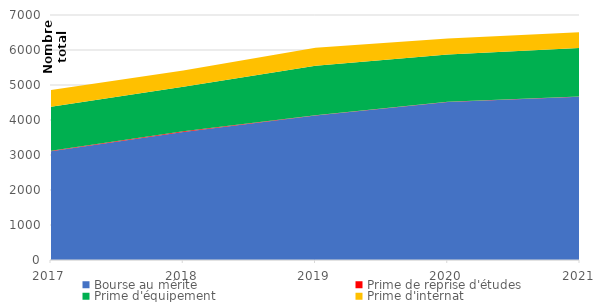
| Category | Bourse au mérite | Prime de reprise d'études | Prime d'équipement | Prime d'internat |
|---|---|---|---|---|
| 2017.0 | 3109 | 14 | 1253 | 481 |
| 2018.0 | 3659 | 18 | 1275 | 465 |
| 2019.0 | 4132 | 5 | 1412 | 518 |
| 2020.0 | 4514 | 5 | 1350 | 458 |
| 2021.0 | 4665 | 7 | 1385 | 452 |